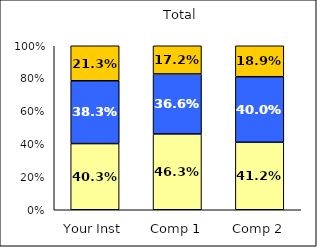
| Category | Low College Reputation Orientation | Average College Reputation Orientation | High College Reputation Orientation |
|---|---|---|---|
| Your Inst | 0.403 | 0.383 | 0.213 |
| Comp 1 | 0.463 | 0.366 | 0.172 |
| Comp 2 | 0.412 | 0.4 | 0.189 |